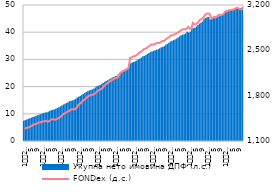
| Category | Укупнa нето имовина ДПФ (л.с.) |
|---|---|
| 1
2010. | 7.432 |
| 2 | 7.676 |
| 3 | 7.899 |
| 4 | 8.15 |
| 5 | 8.327 |
| 6 | 8.568 |
| 7 | 8.841 |
| 8 | 8.995 |
| 9 | 9.206 |
| 10 | 9.488 |
| 11 | 9.639 |
| 12 | 9.863 |
| 1
2011. | 10.082 |
| 2 | 10.238 |
| 3 | 10.435 |
| 4 | 10.51 |
| 5 | 10.725 |
| 6 | 11.067 |
| 7 | 11.306 |
| 8 | 11.45 |
| 9 | 11.587 |
| 10 | 11.853 |
| 11 | 12.123 |
| 12 | 12.452 |
| 1
2012. | 12.722 |
| 2 | 13.086 |
| 3 | 13.424 |
| 4 | 13.664 |
| 5 | 13.998 |
| 6 | 14.251 |
| 7 | 14.626 |
| 8 | 14.843 |
| 9 | 14.949 |
| 10 | 15.164 |
| 11 | 15.488 |
| 12 | 16.011 |
| 1
2013. | 16.312 |
| 2 | 16.606 |
| 3 | 17.045 |
| 4 | 17.324 |
| 5 | 17.63 |
| 6 | 18.041 |
| 7 | 18.363 |
| 8 | 18.611 |
| 9 | 18.841 |
| 10 | 18.989 |
| 11 | 19.318 |
| 12 | 19.701 |
| 1
2014. | 20.09 |
| 2 | 20.353 |
| 3 | 20.591 |
| 4 | 20.907 |
| 5 | 21.365 |
| 6 | 21.731 |
| 7 | 22.07 |
| 8 | 22.377 |
| 9 | 22.695 |
| 10 | 22.976 |
| 11 | 23.345 |
| 12 | 23.565 |
| 1
2015. | 23.891 |
| 2 | 23.98 |
| 3 | 24.649 |
| 4 | 25.107 |
| 5 | 25.375 |
| 6 | 25.527 |
| 7 | 25.849 |
| 8 | 26.048 |
| 9 | 26.4 |
| 10 | 28.345 |
| 11 | 28.533 |
| 12 | 28.875 |
| 1
2016. | 29.063 |
| 2 | 29.32 |
| 3 | 29.641 |
| 4 | 30.062 |
| 5 | 30.363 |
| 6 | 30.713 |
| 7 | 31.161 |
| 8 | 31.309 |
| 9 | 31.585 |
| 10 | 32.066 |
| 11 | 32.326 |
| 12 | 32.79 |
| 1
2017. | 32.869 |
| 2 | 33.119 |
| 3 | 33.378 |
| 4 | 33.567 |
| 5 | 33.733 |
| 6 | 34.082 |
| 7 | 34.431 |
| 8 | 34.568 |
| 9 | 34.884 |
| 10 | 35.366 |
| 11 | 35.717 |
| 12 | 36.152 |
| 1
2018. | 36.58 |
| 2 | 36.731 |
| 3 | 37.098 |
| 4 | 37.331 |
| 5 | 37.654 |
| 6 | 38.068 |
| 7 | 38.458 |
| 8 | 38.868 |
| 9 | 39.096 |
| 10 | 39.259 |
| 11 | 39.594 |
| 12 | 40.185 |
| 1
2019. | 39.918 |
| 2 | 40.205 |
| 3 | 41.641 |
| 4 | 41.434 |
| 5 | 41.619 |
| 6 | 42.072 |
| 7 | 42.658 |
| 8 | 43.177 |
| 9 | 43.484 |
| 10 | 43.928 |
| 11 | 44.725 |
| 12 | 45.246 |
| 1
2020. | 45.504 |
| 2 | 45.63 |
| 3 | 44.646 |
| 4 | 44.766 |
| 5 | 45.186 |
| 6 | 45.144 |
| 7 | 45.438 |
| 8 | 45.855 |
| 9 | 45.862 |
| 10 | 46.06 |
| 11 | 46.289 |
| 12 | 47.018 |
| 1
2021. | 47.284 |
| 2 | 47.539 |
| 3 | 47.713 |
| 4 | 47.89 |
| 5 | 48.016 |
| 6 | 48.204 |
| 7 | 48.544 |
| 8 | 48.843 |
| 9 | 48.805 |
| 10 | 48.741 |
| 11 | 48.916 |
| 12 | 49.053 |